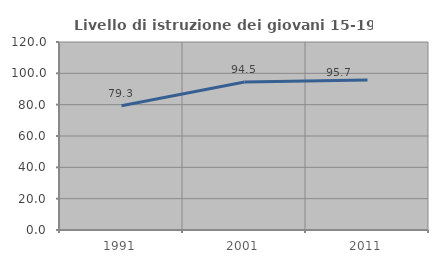
| Category | Livello di istruzione dei giovani 15-19 anni |
|---|---|
| 1991.0 | 79.261 |
| 2001.0 | 94.475 |
| 2011.0 | 95.746 |